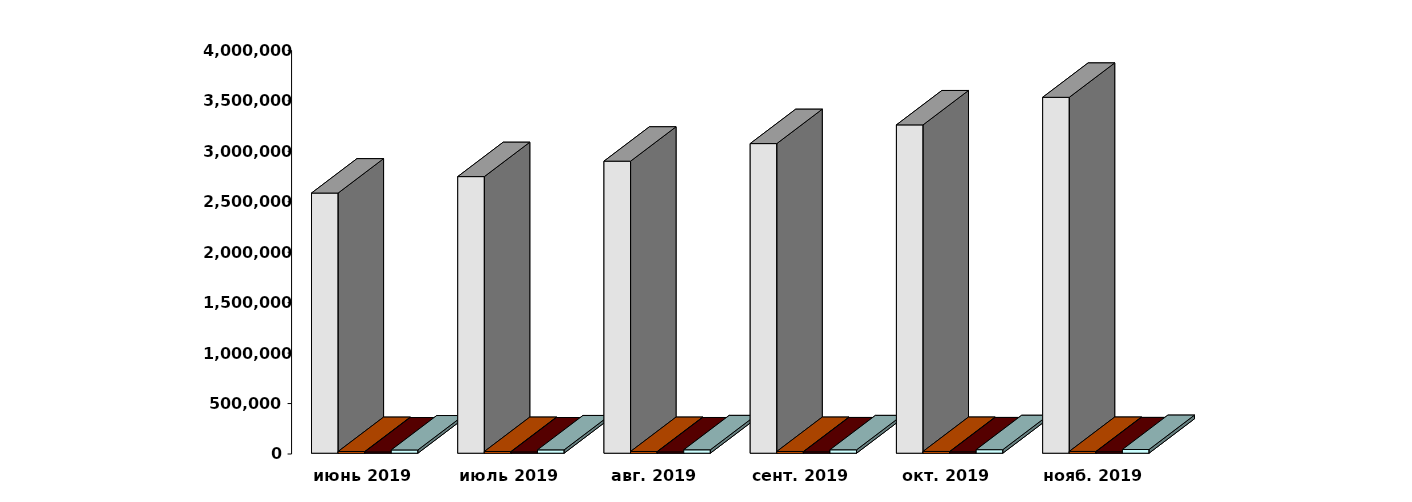
| Category | Физические лица | Юридические лица | Иностранные лица | Клиенты, передавшие свои средства в ДУ |
|---|---|---|---|---|
| 2019-06-30 | 2578398 | 16818 | 12464 | 32273 |
| 2019-07-30 | 2741361 | 16917 | 12726 | 33008 |
| 2019-08-30 | 2894450 | 17007 | 12945 | 33858 |
| 2019-09-30 | 3068547 | 17183 | 13213 | 33842 |
| 2019-10-30 | 3253953 | 17389 | 13455 | 35116 |
| 2019-11-30 | 3527188 | 17527 | 13688 | 36567 |